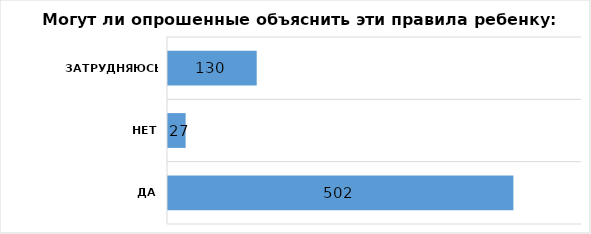
| Category | Series 0 |
|---|---|
| Да | 502 |
| Нет | 27 |
| Затрудняюсь ответить | 130 |